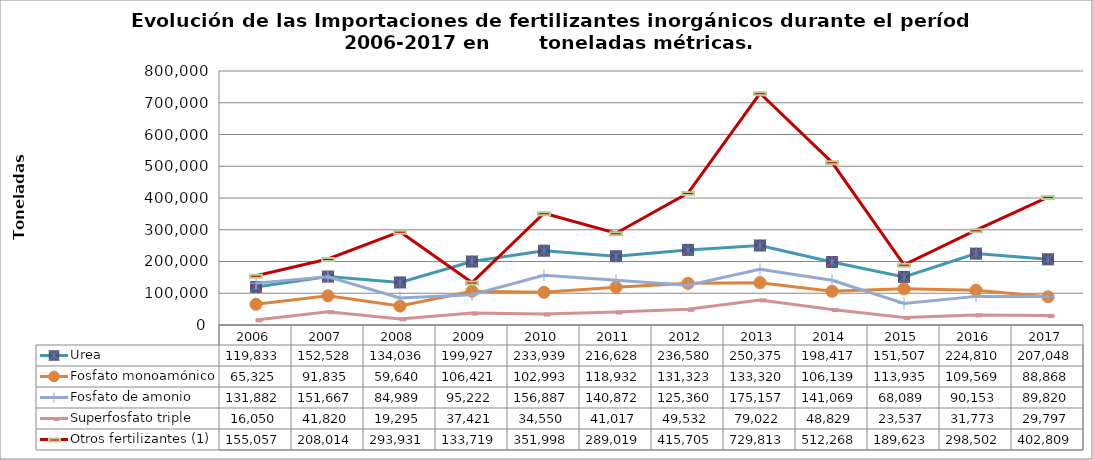
| Category | Urea | Fosfato monoamónico | Fosfato de amonio  | Superfosfato triple | Otros fertilizantes (1) |
|---|---|---|---|---|---|
| 2006.0 | 119833 | 65324.78 | 131882.3 | 16050 | 155057.14 |
| 2007.0 | 152528 | 91835 | 151667 | 41820 | 208014 |
| 2008.0 | 134035.712 | 59639.731 | 84988.545 | 19295 | 293930.833 |
| 2009.0 | 199926.98 | 106421.496 | 95222.314 | 37421 | 133718.641 |
| 2010.0 | 233939.122 | 102993.138 | 156887.14 | 34550 | 351997.64 |
| 2011.0 | 216628 | 118932 | 140872 | 41017 | 289019 |
| 2012.0 | 236580 | 131323 | 125360 | 49532 | 415705 |
| 2013.0 | 250375 | 133320 | 175157 | 79022 | 729813 |
| 2014.0 | 198417 | 106139 | 141069 | 48829 | 512268 |
| 2015.0 | 151506.724 | 113935.196 | 68089.447 | 23536.763 | 189623.142 |
| 2016.0 | 224809.986 | 109568.874 | 90153.152 | 31773.256 | 298501.665 |
| 2017.0 | 207048 | 88868 | 89820 | 29797 | 402809 |